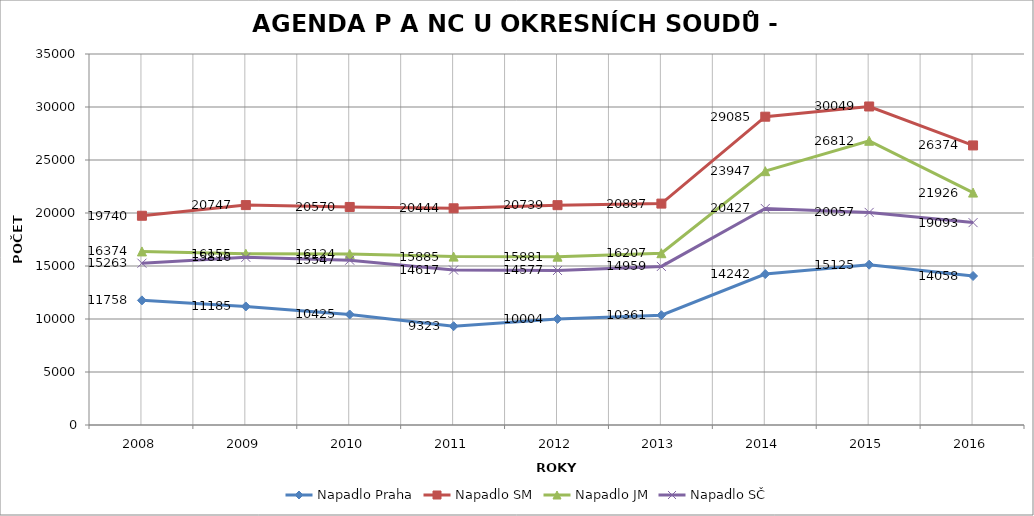
| Category | Napadlo Praha | Napadlo SM | Napadlo JM | Napadlo SČ |
|---|---|---|---|---|
| 2008.0 | 11758 | 19740 | 16374 | 15263 |
| 2009.0 | 11185 | 20747 | 16155 | 15816 |
| 2010.0 | 10425 | 20570 | 16124 | 15547 |
| 2011.0 | 9323 | 20444 | 15885 | 14617 |
| 2012.0 | 10004 | 20739 | 15881 | 14577 |
| 2013.0 | 10361 | 20887 | 16207 | 14959 |
| 2014.0 | 14242 | 29085 | 23947 | 20427 |
| 2015.0 | 15125 | 30049 | 26812 | 20057 |
| 2016.0 | 14058 | 26374 | 21926 | 19093 |